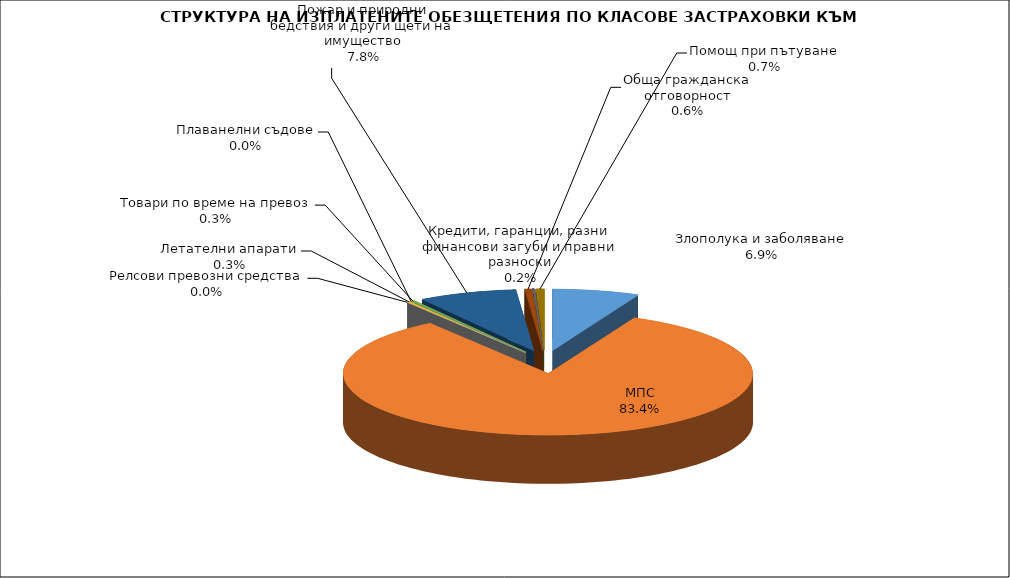
| Category | Злополука и заболяване |
|---|---|
| Злополука и заболяване | 0.069 |
| МПС | 0.834 |
| Релсови превозни средства | 0 |
| Летателни апарати | 0.003 |
| Плаванелни съдове | 0 |
| Товари по време на превоз | 0.003 |
| Пожар и природни бедствия и други щети на имущество | 0.078 |
| Обща гражданска отговорност | 0.006 |
| Кредити, гаранции, разни финансови загуби и правни разноски | 0.002 |
| Помощ при пътуване | 0.007 |